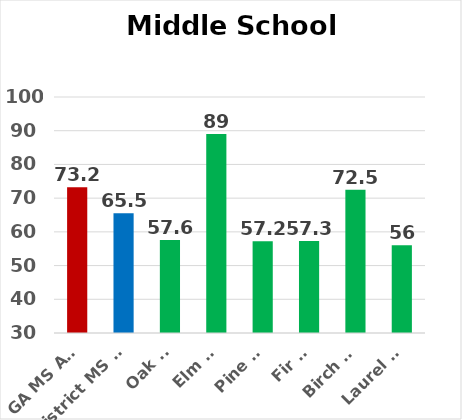
| Category | 2014 CCRPI |
|---|---|
| GA MS Avg | 73.2 |
| District MS Avg | 65.5 |
| Oak MS | 57.6 |
| Elm MS | 89 |
| Pine MS | 57.2 |
| Fir MS | 57.3 |
| Birch MS | 72.5 |
| Laurel MS | 56 |